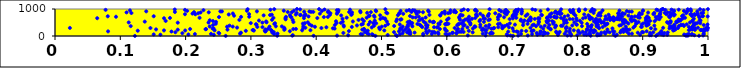
| Category | Series 1 |
|---|---|
| 0.5235519487011274 | 1 |
| 0.12230884167231788 | 2 |
| 0.2613283401278729 | 3 |
| 0.4906580673397771 | 4 |
| 0.8581940545886442 | 5 |
| 0.7016015833464653 | 6 |
| 0.920336045886645 | 7 |
| 0.395974808420415 | 8 |
| 0.9862856929596127 | 9 |
| 0.3403819532866777 | 10 |
| 0.8203217843344026 | 11 |
| 0.9665797291823008 | 12 |
| 0.9690369394837137 | 13 |
| 0.4319460523109031 | 14 |
| 0.36332149996460195 | 15 |
| 0.7093032348197085 | 16 |
| 0.7846863321712239 | 17 |
| 0.6974880248681622 | 18 |
| 0.724006448873877 | 19 |
| 0.6594788418653778 | 20 |
| 0.632229003712798 | 21 |
| 0.9925322709463121 | 22 |
| 0.7901314128307382 | 23 |
| 0.6927187217398437 | 24 |
| 0.8302139645202437 | 25 |
| 0.44890575004881694 | 26 |
| 0.3642412508110733 | 27 |
| 0.9792211535896298 | 28 |
| 0.9105873187091204 | 29 |
| 0.9130056764710549 | 30 |
| 0.9653042478911092 | 31 |
| 0.7998842324881448 | 32 |
| 0.5221488438668945 | 33 |
| 0.9318781116803568 | 34 |
| 0.5640719944765928 | 35 |
| 0.6003300168892703 | 36 |
| 0.5094333163284779 | 37 |
| 0.8330440270042285 | 38 |
| 0.7700869283270952 | 39 |
| 0.4870621742909035 | 40 |
| 0.8138638907979945 | 41 |
| 0.9377697819667304 | 42 |
| 0.7386854707068674 | 43 |
| 0.24322218665280765 | 44 |
| 0.7474692552265593 | 45 |
| 0.9226104825241993 | 46 |
| 0.8960210608921162 | 47 |
| 0.16140490115931838 | 48 |
| 0.8603837110387474 | 49 |
| 0.8355889966388377 | 50 |
| 0.8187516851222281 | 51 |
| 0.8103303035535738 | 52 |
| 0.9682721613812184 | 53 |
| 0.9633926857164341 | 54 |
| 0.9748035770810933 | 55 |
| 0.20424819549670423 | 56 |
| 0.7902966584332625 | 57 |
| 0.4705640627030336 | 58 |
| 0.15114734064947266 | 59 |
| 0.8555475475223804 | 60 |
| 0.6918818933441445 | 61 |
| 0.9935163346492036 | 62 |
| 0.9289537188377915 | 63 |
| 0.4856291143518542 | 64 |
| 0.7306141140192025 | 65 |
| 0.5283369973858142 | 66 |
| 0.9756455913237461 | 67 |
| 0.6038166437849264 | 68 |
| 0.4803362644103165 | 69 |
| 0.46824491840331517 | 70 |
| 0.3356759336342278 | 71 |
| 0.21419242960308968 | 72 |
| 0.8177757510452746 | 73 |
| 0.5769577891268622 | 74 |
| 0.7135872372799961 | 75 |
| 0.5980424195602325 | 76 |
| 0.5440987422949015 | 77 |
| 0.587230091233014 | 78 |
| 0.9705206501195806 | 79 |
| 0.23893677398587698 | 80 |
| 0.7805176637971478 | 81 |
| 0.8306779979204217 | 82 |
| 0.5637992537497213 | 83 |
| 0.7426662310274716 | 84 |
| 0.8788829460312485 | 85 |
| 0.8426533660346757 | 86 |
| 0.8835843161927791 | 87 |
| 0.6550645133893837 | 88 |
| 0.3407732397158864 | 89 |
| 0.28326047146116456 | 90 |
| 0.7711843388374329 | 91 |
| 0.9932292544319598 | 92 |
| 0.6661648517614093 | 93 |
| 0.6146220065951526 | 94 |
| 0.7547091397256117 | 95 |
| 0.9269930151025912 | 96 |
| 0.2515134599281263 | 97 |
| 0.5421419628289992 | 98 |
| 0.5322356945096024 | 99 |
| 0.8041808575284048 | 100 |
| 0.8192369134607009 | 101 |
| 0.6702411053321446 | 102 |
| 0.477920517331033 | 103 |
| 0.9258826303585026 | 104 |
| 0.19505394532257186 | 105 |
| 0.750925717939392 | 106 |
| 0.5698315667608013 | 107 |
| 0.6683038389808819 | 108 |
| 0.750944781343057 | 109 |
| 0.9112569583824525 | 110 |
| 0.7377377550132522 | 111 |
| 0.933335322232728 | 112 |
| 0.441612567077777 | 113 |
| 0.6082540977042036 | 114 |
| 0.7494368489265759 | 115 |
| 0.9291565547705396 | 116 |
| 0.2505506510575249 | 117 |
| 0.5820885150255793 | 118 |
| 0.609397768689713 | 119 |
| 0.7884562518320917 | 120 |
| 0.6679569294558733 | 121 |
| 0.8925045049421552 | 122 |
| 0.28481078692910217 | 123 |
| 0.8366155830227779 | 124 |
| 0.6602332830479136 | 125 |
| 0.550703287273192 | 126 |
| 0.3326733460989183 | 127 |
| 0.7682196576114201 | 128 |
| 0.8245956026715778 | 129 |
| 0.8656823815441198 | 130 |
| 0.9383946838630467 | 131 |
| 0.6160536277261074 | 132 |
| 0.5865858846131866 | 133 |
| 0.6396521600442944 | 134 |
| 0.8493602571276568 | 135 |
| 0.5391025068252928 | 136 |
| 0.9160744684771528 | 137 |
| 0.9007623364432581 | 138 |
| 0.18432985109953315 | 139 |
| 0.543708892847291 | 140 |
| 0.8415574765204903 | 141 |
| 0.519190777159661 | 142 |
| 0.4742169759082336 | 143 |
| 0.3349967483831373 | 144 |
| 0.8990737446223888 | 145 |
| 0.5805880002066636 | 146 |
| 0.7490557448137768 | 147 |
| 0.708928126310255 | 148 |
| 0.8128845114239555 | 149 |
| 0.8705622694810596 | 150 |
| 0.6257149832050453 | 151 |
| 0.7728411885396286 | 152 |
| 0.5777020405067421 | 153 |
| 0.7442284041129147 | 154 |
| 0.8759815008924945 | 155 |
| 0.8080263881397457 | 156 |
| 0.8014488351418213 | 157 |
| 0.6202112465237204 | 158 |
| 0.6227692604214488 | 159 |
| 0.7673709899633256 | 160 |
| 0.8454136492592794 | 161 |
| 0.6939836943531836 | 162 |
| 0.3220495808270462 | 163 |
| 0.8564161508163931 | 164 |
| 0.1783623383744279 | 165 |
| 0.9939626660669265 | 166 |
| 0.7070280688445979 | 167 |
| 0.568349949456651 | 168 |
| 0.7433648352089469 | 169 |
| 0.5267907039884581 | 170 |
| 0.08126696022789225 | 171 |
| 0.7829328401409156 | 172 |
| 0.4772623344564271 | 173 |
| 0.9059733641585581 | 174 |
| 0.8542640361579436 | 175 |
| 0.35966957422094115 | 176 |
| 0.5334407028638493 | 177 |
| 0.7301041680855334 | 178 |
| 0.7881211847275192 | 179 |
| 0.9286668740558869 | 180 |
| 0.4500569560984713 | 181 |
| 0.7301535117483269 | 182 |
| 0.7024175444573403 | 183 |
| 0.8272877537126094 | 184 |
| 0.5428114721474644 | 185 |
| 0.7215753049799427 | 186 |
| 0.3228512338871074 | 187 |
| 0.5999422875255558 | 188 |
| 0.6337267645985744 | 189 |
| 0.5730951698199869 | 190 |
| 0.7145210507509185 | 191 |
| 0.2922250349052479 | 192 |
| 0.8668368317487913 | 193 |
| 0.3318971456249642 | 194 |
| 0.32129394080411616 | 195 |
| 0.12671966796256956 | 196 |
| 0.8187458393586128 | 197 |
| 0.4789654889320767 | 198 |
| 0.8013173692215011 | 199 |
| 0.993619970936671 | 200 |
| 0.8716840016326416 | 201 |
| 0.30460120565764043 | 202 |
| 0.7329518784253726 | 203 |
| 0.1993211181962148 | 204 |
| 0.5042722021589667 | 205 |
| 0.6153783111803749 | 206 |
| 0.1669134216621404 | 207 |
| 0.946521459740113 | 208 |
| 0.7945065382835653 | 209 |
| 0.3784516274088653 | 210 |
| 0.24436717812384778 | 211 |
| 0.9478988307586219 | 212 |
| 0.6581069316482346 | 213 |
| 0.8217436245613633 | 214 |
| 0.3911702812747875 | 215 |
| 0.3037428570979069 | 216 |
| 0.8258379997002943 | 217 |
| 0.9706357433206427 | 218 |
| 0.9888171473285219 | 219 |
| 0.30269145733267716 | 220 |
| 0.5978375152446678 | 221 |
| 0.6540499203941836 | 222 |
| 0.8206123060160743 | 223 |
| 0.6605758234690693 | 224 |
| 0.9897140596943679 | 225 |
| 0.9799927370891722 | 226 |
| 0.33071675006904583 | 227 |
| 0.3511721003990729 | 228 |
| 0.873795010193375 | 229 |
| 0.9990617111579827 | 230 |
| 0.8756996267538104 | 231 |
| 0.9963832511653307 | 232 |
| 0.2641253229985399 | 233 |
| 0.18798168545604055 | 234 |
| 0.8797314738698051 | 235 |
| 0.541704034825394 | 236 |
| 0.47057619772781334 | 237 |
| 0.9760385969268773 | 238 |
| 0.9729428589131437 | 239 |
| 0.8144944399409192 | 240 |
| 0.5364049880960107 | 241 |
| 0.9501293812977795 | 242 |
| 0.8459320622358165 | 243 |
| 0.3222580660547085 | 244 |
| 0.1547616302566619 | 245 |
| 0.7592742620327195 | 246 |
| 0.8762334404720238 | 247 |
| 0.9936511425193604 | 248 |
| 0.8700670002621991 | 249 |
| 0.49746919341946044 | 250 |
| 0.4730921960794678 | 251 |
| 0.2312896462073643 | 252 |
| 0.23055580181900745 | 253 |
| 0.9192915577984264 | 254 |
| 0.5286428330041713 | 255 |
| 0.8152106688993749 | 256 |
| 0.589478554579398 | 257 |
| 0.36494692784609856 | 258 |
| 0.2069615132158382 | 259 |
| 0.6237534375254389 | 260 |
| 0.473387533967175 | 261 |
| 0.36895286020038165 | 262 |
| 0.8747051568766743 | 263 |
| 0.6171698344137668 | 264 |
| 0.32616817872944204 | 265 |
| 0.5309116644367678 | 266 |
| 0.3516503484896553 | 267 |
| 0.6684757550009 | 268 |
| 0.7582083071638687 | 269 |
| 0.6558066238453091 | 270 |
| 0.7884732509622105 | 271 |
| 0.7474824052960707 | 272 |
| 0.5680007749017021 | 273 |
| 0.4282491934926879 | 274 |
| 0.5971017638138066 | 275 |
| 0.2413955524204215 | 276 |
| 0.6400128040085308 | 277 |
| 0.7825661166102377 | 278 |
| 0.9461720714360553 | 279 |
| 0.6712320381065257 | 280 |
| 0.24282279970337461 | 281 |
| 0.8536591271203494 | 282 |
| 0.9409943204512086 | 283 |
| 0.4255726615764859 | 284 |
| 0.7007594123905019 | 285 |
| 0.9126607768706497 | 286 |
| 0.685139398818656 | 287 |
| 0.9806193846729072 | 288 |
| 0.9973627105509255 | 289 |
| 0.8333565972631097 | 290 |
| 0.3801598172058873 | 291 |
| 0.9763239710741989 | 292 |
| 0.529253176278306 | 293 |
| 0.9540461187877002 | 294 |
| 0.1461536635208711 | 295 |
| 0.40798232178279786 | 296 |
| 0.6120793474402392 | 297 |
| 0.6726914299339141 | 298 |
| 0.02279367073040658 | 299 |
| 0.9999562973177825 | 300 |
| 0.7282046443763439 | 301 |
| 0.6853035410951196 | 302 |
| 0.9979719514962117 | 303 |
| 0.931304533150216 | 304 |
| 0.3834283745572842 | 305 |
| 0.9845472027089599 | 306 |
| 0.3509170026399535 | 307 |
| 0.9458262216973878 | 308 |
| 0.7826658897634824 | 309 |
| 0.49633492529834344 | 310 |
| 0.8856908456882074 | 311 |
| 0.27882386866281567 | 312 |
| 0.7553301268825903 | 313 |
| 0.5384494601190284 | 314 |
| 0.585042855225897 | 315 |
| 0.6640413255040323 | 316 |
| 0.4851392932992471 | 317 |
| 0.7658444990063564 | 318 |
| 0.6315592814014216 | 319 |
| 0.8321298384137502 | 320 |
| 0.9454210320851694 | 321 |
| 0.5700440151138236 | 322 |
| 0.41556980816739547 | 323 |
| 0.6950703193657976 | 324 |
| 0.580430415584356 | 325 |
| 0.6788463671071462 | 326 |
| 0.8209051094042942 | 327 |
| 0.7834857079628794 | 328 |
| 0.31772527071170586 | 329 |
| 0.5624099021328256 | 330 |
| 0.6514221789742791 | 331 |
| 0.5861149930310036 | 332 |
| 0.9708395971305014 | 333 |
| 0.838654856834232 | 334 |
| 0.30981164801133676 | 335 |
| 0.45455520258278725 | 336 |
| 0.9488946968674664 | 337 |
| 0.8976252398195472 | 338 |
| 0.6437124668791259 | 339 |
| 0.9758393979783831 | 340 |
| 0.6865907225341776 | 341 |
| 0.3981026758006774 | 342 |
| 0.898677120703996 | 343 |
| 0.26347340947492287 | 344 |
| 0.7440397742569229 | 345 |
| 0.5003778293831095 | 346 |
| 0.32857324433319995 | 347 |
| 0.2722116337117664 | 348 |
| 0.5324383122702436 | 349 |
| 0.9437370649913569 | 350 |
| 0.8739781315238256 | 351 |
| 0.23689646684146165 | 352 |
| 0.44239428254905994 | 353 |
| 0.8163148316613855 | 354 |
| 0.3474318222311767 | 355 |
| 0.8294253651011824 | 356 |
| 0.5473036288626207 | 357 |
| 0.6427035268927515 | 358 |
| 0.3382077478393938 | 359 |
| 0.5408072582745891 | 360 |
| 0.9416266873669131 | 361 |
| 0.7366749385770921 | 362 |
| 0.38027726161747 | 363 |
| 0.8069189812504635 | 364 |
| 0.8203728357735739 | 365 |
| 0.11591327349100597 | 366 |
| 0.8879479300022468 | 367 |
| 0.766981693954358 | 368 |
| 0.9553434559426401 | 369 |
| 0.6596225127032601 | 370 |
| 0.6887725310843295 | 371 |
| 0.5194111759177312 | 372 |
| 0.9631659176749274 | 373 |
| 0.6254925997705589 | 374 |
| 0.6848020186006963 | 375 |
| 0.7771376481949588 | 376 |
| 0.7498963646735824 | 377 |
| 0.4885373414539868 | 378 |
| 0.5057738722880508 | 379 |
| 0.7749975678922264 | 380 |
| 0.5604654530507399 | 381 |
| 0.39321171604198507 | 382 |
| 0.9057102986513071 | 383 |
| 0.26727144755791776 | 384 |
| 0.9485927033323853 | 385 |
| 0.917818353906267 | 386 |
| 0.7670081614005915 | 387 |
| 0.9778621129740548 | 388 |
| 0.8642265449447727 | 389 |
| 0.7921640314792675 | 390 |
| 0.4624373352561892 | 391 |
| 0.8426456780014989 | 392 |
| 0.44194490545744625 | 393 |
| 0.9578403894762118 | 394 |
| 0.6158258575916441 | 395 |
| 0.5682233916340682 | 396 |
| 0.570633007114956 | 397 |
| 0.5401537203768864 | 398 |
| 0.7311768505990132 | 399 |
| 0.7168362061286889 | 400 |
| 0.8668919441788233 | 401 |
| 0.8219782883978802 | 402 |
| 0.9070846093178815 | 403 |
| 0.9935030421405895 | 404 |
| 0.6272439642723812 | 405 |
| 0.24203444979435454 | 406 |
| 0.4285395567541678 | 407 |
| 0.8294696119777346 | 408 |
| 0.664990965443159 | 409 |
| 0.9482131326224118 | 410 |
| 0.7569753665896373 | 411 |
| 0.8315562615430415 | 412 |
| 0.6924821846833281 | 413 |
| 0.962093551315797 | 414 |
| 0.5585849931437898 | 415 |
| 0.9591371167129432 | 416 |
| 0.6513849551831268 | 417 |
| 0.3087005299502792 | 418 |
| 0.7991141358900574 | 419 |
| 0.7333822111762678 | 420 |
| 0.7043986996543622 | 421 |
| 0.4692326001832518 | 422 |
| 0.6360541971425578 | 423 |
| 0.8984207867675672 | 424 |
| 0.48019320798743964 | 425 |
| 0.9993102954036404 | 426 |
| 0.5280701330519852 | 427 |
| 0.9091569197086035 | 428 |
| 0.38977523202419895 | 429 |
| 0.798513980830302 | 430 |
| 0.9673604196249163 | 431 |
| 0.617602231885556 | 432 |
| 0.5889417776432773 | 433 |
| 0.5460185766573261 | 434 |
| 0.5989306866601409 | 435 |
| 0.30771076216185334 | 436 |
| 0.509899075646618 | 437 |
| 0.597495606833769 | 438 |
| 0.6784127909953954 | 439 |
| 0.9781454806219565 | 440 |
| 0.8456208076112549 | 441 |
| 0.7403170181388465 | 442 |
| 0.5998606779695309 | 443 |
| 0.4713533133536791 | 444 |
| 0.555050628339182 | 445 |
| 0.3358832864605372 | 446 |
| 0.9808549094016593 | 447 |
| 0.7236925363312884 | 448 |
| 0.815006068597113 | 449 |
| 0.8294929473158775 | 450 |
| 0.6184404978054113 | 451 |
| 0.6024716222831478 | 452 |
| 0.24620345869592017 | 453 |
| 0.9084919806981383 | 454 |
| 0.7629755264260972 | 455 |
| 0.8900107661039168 | 456 |
| 0.6812629396059169 | 457 |
| 0.5871712536762966 | 458 |
| 0.3796207776948996 | 459 |
| 0.5997462286269366 | 460 |
| 0.6001904399929348 | 461 |
| 0.8457878697941795 | 462 |
| 0.8779336131741025 | 463 |
| 0.900686096230294 | 464 |
| 0.6223439713402721 | 465 |
| 0.6964891771075236 | 466 |
| 0.8708671562697938 | 467 |
| 0.636160442727238 | 468 |
| 0.9801298969897176 | 469 |
| 0.49187644822778714 | 470 |
| 0.3369609020109338 | 471 |
| 0.488794258104288 | 472 |
| 0.9883207808225496 | 473 |
| 0.5422791472556074 | 474 |
| 0.7797365115412334 | 475 |
| 0.3826286747548335 | 476 |
| 0.29975564804315435 | 477 |
| 0.8904663374305373 | 478 |
| 0.4873508538147648 | 479 |
| 0.43114338031793775 | 480 |
| 0.9391269068104175 | 481 |
| 0.8408244968489349 | 482 |
| 0.5469839336305333 | 483 |
| 0.5672934152080318 | 484 |
| 0.870772230382125 | 485 |
| 0.4376853374725861 | 486 |
| 0.9840381742304635 | 487 |
| 0.8291107456444622 | 488 |
| 0.8065394304849758 | 489 |
| 0.9041279860889454 | 490 |
| 0.8367990103699615 | 491 |
| 0.9403576646766243 | 492 |
| 0.18799088817533421 | 493 |
| 0.6246490479726435 | 494 |
| 0.7837276130664494 | 495 |
| 0.31761594259546944 | 496 |
| 0.2350699669900016 | 497 |
| 0.9426780030195506 | 498 |
| 0.7168986304785984 | 499 |
| 0.9722991468712524 | 500 |
| 0.951685942556015 | 501 |
| 0.7534726682224702 | 502 |
| 0.11290774352121893 | 503 |
| 0.8280934464942687 | 504 |
| 0.7953593326691196 | 505 |
| 0.6351370558785063 | 506 |
| 0.3871309297805687 | 507 |
| 0.32407691716836207 | 508 |
| 0.9372789871697917 | 509 |
| 0.5785043000643645 | 510 |
| 0.8286520425216781 | 511 |
| 0.5801892394457234 | 512 |
| 0.7637034085098178 | 513 |
| 0.5400634407996049 | 514 |
| 0.893708583339412 | 515 |
| 0.3650973097515876 | 516 |
| 0.8751735302034209 | 517 |
| 0.7411715682174504 | 518 |
| 0.5435402659375066 | 519 |
| 0.8397811775599712 | 520 |
| 0.7541361459245401 | 521 |
| 0.6568327297971633 | 522 |
| 0.48239674738581584 | 523 |
| 0.246594528335261 | 524 |
| 0.7537345724659265 | 525 |
| 0.9080595865951305 | 526 |
| 0.5799260612347762 | 527 |
| 0.8359504564484391 | 528 |
| 0.7406082814163597 | 529 |
| 0.9422000132349565 | 530 |
| 0.44071092392508626 | 531 |
| 0.13749936124725723 | 532 |
| 0.5908740267781228 | 533 |
| 0.9514731403626062 | 534 |
| 0.8317766197563903 | 535 |
| 0.5645369787664614 | 536 |
| 0.45621887751566154 | 537 |
| 0.3232783998784303 | 538 |
| 0.5082102054800326 | 539 |
| 0.8694551293648718 | 540 |
| 0.8252539549108967 | 541 |
| 0.5429480316565125 | 542 |
| 0.954094790994007 | 543 |
| 0.5739603511309134 | 544 |
| 0.43029424906524966 | 545 |
| 0.8830331836395008 | 546 |
| 0.5226103797514148 | 547 |
| 0.9428290686821159 | 548 |
| 0.6500992465967582 | 549 |
| 0.9182801451683835 | 550 |
| 0.7615658590727729 | 551 |
| 0.7527908545979195 | 552 |
| 0.8890152563771073 | 553 |
| 0.24187793472964683 | 554 |
| 0.47296287437338996 | 555 |
| 0.9758206278685306 | 556 |
| 0.16950847932226198 | 557 |
| 0.6331201321382466 | 558 |
| 0.6252563008825461 | 559 |
| 0.9113901969486067 | 560 |
| 0.8696261567206646 | 561 |
| 0.7248565983577785 | 562 |
| 0.724428975714906 | 563 |
| 0.8038858737035528 | 564 |
| 0.9765477888288466 | 565 |
| 0.9569301324958279 | 566 |
| 0.7282317250754446 | 567 |
| 0.7793415603201111 | 568 |
| 0.5569758616339632 | 569 |
| 0.8311142414031274 | 570 |
| 0.4896946130063296 | 571 |
| 0.3123647207973445 | 572 |
| 0.9886562597124186 | 573 |
| 0.7130821401853669 | 574 |
| 0.756201300207612 | 575 |
| 0.8324695642092452 | 576 |
| 0.7188809030478562 | 577 |
| 0.8559500198691506 | 578 |
| 0.9059397951343241 | 579 |
| 0.8729962787895855 | 580 |
| 0.7991749161660218 | 581 |
| 0.9872589637027532 | 582 |
| 0.23698274767724878 | 583 |
| 0.7827816089752325 | 584 |
| 0.8556140813277429 | 585 |
| 0.904811598159024 | 586 |
| 0.8864184830391275 | 587 |
| 0.6637589488678571 | 588 |
| 0.9559899736810638 | 589 |
| 0.6510225305092551 | 590 |
| 0.850083879524237 | 591 |
| 0.8277418892907207 | 592 |
| 0.8818953742918464 | 593 |
| 0.9573842691069387 | 594 |
| 0.46483847500856673 | 595 |
| 0.2823482758772858 | 596 |
| 0.36400634769710455 | 597 |
| 0.6202472535305794 | 598 |
| 0.9587220625616697 | 599 |
| 0.3323401979193569 | 600 |
| 0.6343953207233752 | 601 |
| 0.6002873883440943 | 602 |
| 0.834300686997401 | 603 |
| 0.5288658611733148 | 604 |
| 0.8707385707641525 | 605 |
| 0.5592986253444014 | 606 |
| 0.7135386779931373 | 607 |
| 0.6280156052542608 | 608 |
| 0.7259325513093148 | 609 |
| 0.6658418378451432 | 610 |
| 0.8547995016384009 | 611 |
| 0.9551000221945262 | 612 |
| 0.8642253609353981 | 613 |
| 0.5235857185590844 | 614 |
| 0.7413563899600721 | 615 |
| 0.6785388205058448 | 616 |
| 0.35319292655459744 | 617 |
| 0.8426194738979306 | 618 |
| 0.4705444660198549 | 619 |
| 0.530487206669182 | 620 |
| 0.9254169948036738 | 621 |
| 0.8193543408673707 | 622 |
| 0.9210613066344174 | 623 |
| 0.8512282844428897 | 624 |
| 0.792820665143203 | 625 |
| 0.8609139312894976 | 626 |
| 0.8456556075221622 | 627 |
| 0.6962463330551671 | 628 |
| 0.8815482013881184 | 629 |
| 0.7882255497976468 | 630 |
| 0.734645030048658 | 631 |
| 0.4983041642616458 | 632 |
| 0.6315137668233295 | 633 |
| 0.7786056775612513 | 634 |
| 0.44031099463234974 | 635 |
| 0.8285123179440946 | 636 |
| 0.6385929363790969 | 637 |
| 0.5625310571578416 | 638 |
| 0.8549079369571577 | 639 |
| 0.5051733287156943 | 640 |
| 0.8610226064187831 | 641 |
| 0.5055357770077464 | 642 |
| 0.7288582679905456 | 643 |
| 0.978369328322576 | 644 |
| 0.658582523751179 | 645 |
| 0.8660551261895538 | 646 |
| 0.8185655876239349 | 647 |
| 0.8627567282330925 | 648 |
| 0.8226618839157233 | 649 |
| 0.602889501807224 | 650 |
| 0.6560364882619077 | 651 |
| 0.70115716564423 | 652 |
| 0.8086298464685682 | 653 |
| 0.7984448926314149 | 654 |
| 0.7398085721609631 | 655 |
| 0.16698055520639254 | 656 |
| 0.6193909010369687 | 657 |
| 0.9618649538457944 | 658 |
| 0.06465754427067126 | 659 |
| 0.3812598428991331 | 660 |
| 0.8600984523407392 | 661 |
| 0.7416899431090438 | 662 |
| 0.3529028904262392 | 663 |
| 0.753557607249965 | 664 |
| 0.4017281295618945 | 665 |
| 0.6435956922442212 | 666 |
| 0.904720960464073 | 667 |
| 0.9092937690926022 | 668 |
| 0.17607283016484507 | 669 |
| 0.3344689022731271 | 670 |
| 0.706444336060456 | 671 |
| 0.7748470578984508 | 672 |
| 0.2213898233803159 | 673 |
| 0.5017467666398532 | 674 |
| 0.8204880052445852 | 675 |
| 0.9648989824036915 | 676 |
| 0.47733689450058614 | 677 |
| 0.8954237513533592 | 678 |
| 0.44671188159133024 | 679 |
| 0.8498376865370062 | 680 |
| 0.7674309608182751 | 681 |
| 0.7535339470074199 | 682 |
| 0.8555240601644057 | 683 |
| 0.8125545304524842 | 684 |
| 0.5676151495803732 | 685 |
| 0.9867271046852674 | 686 |
| 0.5524235499015512 | 687 |
| 0.8930845744155221 | 688 |
| 0.5477311393156866 | 689 |
| 0.8548884171231897 | 690 |
| 0.7280953799327712 | 691 |
| 0.7685688556996364 | 692 |
| 0.9413814149500769 | 693 |
| 0.6876894583400677 | 694 |
| 0.61883385165437 | 695 |
| 0.6783287827419423 | 696 |
| 0.8491089481342906 | 697 |
| 0.8828763978420352 | 698 |
| 0.36193410567504775 | 699 |
| 0.7646561977067944 | 700 |
| 0.25116357205796297 | 701 |
| 0.4116873990135851 | 702 |
| 0.9275455242487992 | 703 |
| 0.9199979010906677 | 704 |
| 0.7590966853546405 | 705 |
| 0.4178217196255146 | 706 |
| 0.9870679663514548 | 707 |
| 0.4893582527577138 | 708 |
| 0.28491618738215563 | 709 |
| 0.35371365418632 | 710 |
| 0.883192413818917 | 711 |
| 0.9070532927494146 | 712 |
| 0.09339856641410686 | 713 |
| 0.5572064998170121 | 714 |
| 0.29737747800884873 | 715 |
| 0.6340095419313979 | 716 |
| 0.36073133013149183 | 717 |
| 0.756163483189713 | 718 |
| 0.9065650835537916 | 719 |
| 0.8185495305197505 | 720 |
| 0.9403028449548491 | 721 |
| 0.7803999771502688 | 722 |
| 0.3882910037914954 | 723 |
| 0.8880232024377643 | 724 |
| 0.9995659604709032 | 725 |
| 0.7646874101428074 | 726 |
| 0.8686087558110754 | 727 |
| 0.7007986516105085 | 728 |
| 0.8431225065587109 | 729 |
| 0.08080648906789455 | 730 |
| 0.9240869543656725 | 731 |
| 0.15116256551928722 | 732 |
| 0.8924078389112553 | 733 |
| 0.9923169707852649 | 734 |
| 0.9913143910744533 | 735 |
| 0.9602520948176048 | 736 |
| 0.38135437193575966 | 737 |
| 0.7009221977585319 | 738 |
| 0.5436577776845208 | 739 |
| 0.9754850367771314 | 740 |
| 0.4808441400009162 | 741 |
| 0.867272379856632 | 742 |
| 0.7048487655759869 | 743 |
| 0.9425344258161013 | 744 |
| 0.6633264156629319 | 745 |
| 0.942355136356868 | 746 |
| 0.7209292298456423 | 747 |
| 0.6463809420886991 | 748 |
| 0.6555010474336849 | 749 |
| 0.48172236303847454 | 750 |
| 0.8630241888303155 | 751 |
| 0.8354050035686459 | 752 |
| 0.2742239819342524 | 753 |
| 0.48850919642145574 | 754 |
| 0.6817163101409458 | 755 |
| 0.8780724509335519 | 756 |
| 0.7856639208893667 | 757 |
| 0.831418311100233 | 758 |
| 0.6628569687424973 | 759 |
| 0.947826790078415 | 760 |
| 0.4382231436296306 | 761 |
| 0.5901231589061973 | 762 |
| 0.7970061903181579 | 763 |
| 0.3195422857501843 | 764 |
| 0.6241934387508775 | 765 |
| 0.49791995295669167 | 766 |
| 0.5897904127023161 | 767 |
| 0.8168398210036614 | 768 |
| 0.5251167275423793 | 769 |
| 0.9620469448701704 | 770 |
| 0.7456503720707797 | 771 |
| 0.6212039447434815 | 772 |
| 0.35980206785708607 | 773 |
| 0.37562586684886845 | 774 |
| 0.3836139760339926 | 775 |
| 0.3292940579499904 | 776 |
| 0.9800117027638424 | 777 |
| 0.9846225799200254 | 778 |
| 0.6211010018694244 | 779 |
| 0.5733897899144781 | 780 |
| 0.7446749787513941 | 781 |
| 0.7017018410209472 | 782 |
| 0.4209884691804551 | 783 |
| 0.3760624281457701 | 784 |
| 0.6798874665854412 | 785 |
| 0.45368643254836377 | 786 |
| 0.332140784890526 | 787 |
| 0.8477541231295272 | 788 |
| 0.6453312203200323 | 789 |
| 0.6446622571520232 | 790 |
| 0.9491124349824296 | 791 |
| 0.8947133851936598 | 792 |
| 0.7578931545773085 | 793 |
| 0.3688155200109694 | 794 |
| 0.9425987166461167 | 795 |
| 0.8945750067548166 | 796 |
| 0.2661399882379245 | 797 |
| 0.691106478978164 | 798 |
| 0.38315480924605844 | 799 |
| 0.45452835952007764 | 800 |
| 0.8104410161790964 | 801 |
| 0.9730768176720833 | 802 |
| 0.7235605508718891 | 803 |
| 0.9364585227170523 | 804 |
| 0.2149385025097279 | 805 |
| 0.7064095035587038 | 806 |
| 0.19904852908792847 | 807 |
| 0.92645917757771 | 808 |
| 0.7732245002794738 | 809 |
| 0.5540994719475453 | 810 |
| 0.2972802404169328 | 811 |
| 0.9164241972115498 | 812 |
| 0.9793984302806249 | 813 |
| 0.9745804162907971 | 814 |
| 0.7944693823452557 | 815 |
| 0.8679381521788463 | 816 |
| 0.9263283069881544 | 817 |
| 0.8986151065126551 | 818 |
| 0.9450723426010539 | 819 |
| 0.6645041011210617 | 820 |
| 0.8723737539175874 | 821 |
| 0.5333220332351121 | 822 |
| 0.6512872933307748 | 823 |
| 0.7692280353990156 | 824 |
| 0.9172774963026438 | 825 |
| 0.4316646070944628 | 826 |
| 0.7756254728252502 | 827 |
| 0.40566797637340696 | 828 |
| 0.21051651079759334 | 829 |
| 0.5971686468479764 | 830 |
| 0.7144996286177514 | 831 |
| 0.6918613454142565 | 832 |
| 0.27244147090312926 | 833 |
| 0.9839931298399308 | 834 |
| 0.8622888512647231 | 835 |
| 0.5269647659046103 | 836 |
| 0.8631736243273451 | 837 |
| 0.9470785105203192 | 838 |
| 0.8333669714838338 | 839 |
| 0.7604182769158152 | 840 |
| 0.6741980621139892 | 841 |
| 0.21930025258611885 | 842 |
| 0.5089057667477382 | 843 |
| 0.5279286043877587 | 844 |
| 0.4217322615675573 | 845 |
| 0.8951724520420088 | 846 |
| 0.9897930257988309 | 847 |
| 0.8691062657895391 | 848 |
| 0.6021277729633914 | 849 |
| 0.9668204189280919 | 850 |
| 0.11701685324786187 | 851 |
| 0.3701286916264771 | 852 |
| 0.8248314705115495 | 853 |
| 0.6895878626430906 | 854 |
| 0.9925398632369727 | 855 |
| 0.5534466429526251 | 856 |
| 0.9336941279329001 | 857 |
| 0.9178309707218805 | 858 |
| 0.5927396765479898 | 859 |
| 0.6882387171802393 | 860 |
| 0.47809739099687354 | 861 |
| 0.6051155508101593 | 862 |
| 0.8358468496601961 | 863 |
| 0.43250064728400617 | 864 |
| 0.7709085601260034 | 865 |
| 0.703854529228207 | 866 |
| 0.507252847589601 | 867 |
| 0.908257501548757 | 868 |
| 0.9421309644989355 | 869 |
| 0.7654470048828808 | 870 |
| 0.22295842836482982 | 871 |
| 0.45491441693868967 | 872 |
| 0.9666305431780959 | 873 |
| 0.10959046641276553 | 874 |
| 0.7941063873467528 | 875 |
| 0.9380432644902362 | 876 |
| 0.23545621691101393 | 877 |
| 0.6139225724023386 | 878 |
| 0.46790722152722136 | 879 |
| 0.5635819762915248 | 880 |
| 0.36260313323385335 | 881 |
| 0.4179505256974244 | 882 |
| 0.4837754414188497 | 883 |
| 0.21297139449890168 | 884 |
| 0.4504433606657546 | 885 |
| 0.7902118896778025 | 886 |
| 0.552715903323345 | 887 |
| 0.1835760779158372 | 888 |
| 0.3563949883472874 | 889 |
| 0.5458979165232756 | 890 |
| 0.9270949123298882 | 891 |
| 0.3955263580373237 | 892 |
| 0.39195903542366456 | 893 |
| 0.6936760711484804 | 894 |
| 0.6134558635551955 | 895 |
| 0.5544900470370314 | 896 |
| 0.5576426164104938 | 897 |
| 0.6108037321276938 | 898 |
| 0.8796131154684624 | 899 |
| 0.38161589679351887 | 900 |
| 0.7081978488980546 | 901 |
| 0.7731017689921077 | 902 |
| 0.4337240604374371 | 903 |
| 0.8833382667417234 | 904 |
| 0.5725719487701315 | 905 |
| 0.7667366029793192 | 906 |
| 0.715192094501642 | 907 |
| 0.3895509121553926 | 908 |
| 0.25571092209448126 | 909 |
| 0.5967868142511374 | 910 |
| 0.25316431415785773 | 911 |
| 0.3092499845499903 | 912 |
| 0.13969704727175067 | 913 |
| 0.9476419284443 | 914 |
| 0.9836192663113786 | 915 |
| 0.6834474656198747 | 916 |
| 0.7038161351909962 | 917 |
| 0.49182639372456854 | 918 |
| 0.8202172248075189 | 919 |
| 0.4184851661126767 | 920 |
| 0.6458814121963852 | 921 |
| 0.46739737591277103 | 922 |
| 0.8756116987699426 | 923 |
| 0.8024903299051086 | 924 |
| 0.9686492867740192 | 925 |
| 0.7435009966271474 | 926 |
| 0.4086911212427795 | 927 |
| 0.5292372759290823 | 928 |
| 0.9631141558309698 | 929 |
| 0.20243172144633403 | 930 |
| 0.9000789888852998 | 931 |
| 0.5383462368253963 | 932 |
| 0.9740044969894973 | 933 |
| 0.29395687567891393 | 934 |
| 0.8023746636996291 | 935 |
| 0.365823801507166 | 936 |
| 0.35036104445908806 | 937 |
| 0.5713305052153631 | 938 |
| 0.8220834968683051 | 939 |
| 0.8644168963855836 | 940 |
| 0.9480352430569211 | 941 |
| 0.6891070255479378 | 942 |
| 0.6223326920391272 | 943 |
| 0.550922049364533 | 944 |
| 0.9005875167932139 | 945 |
| 0.49119781014758934 | 946 |
| 0.6117972263736717 | 947 |
| 0.1147584373854172 | 948 |
| 0.8385619308287059 | 949 |
| 0.6056475213627496 | 950 |
| 0.6431764115063496 | 951 |
| 0.7884969095420519 | 952 |
| 0.4316318309984269 | 953 |
| 0.5478907478185692 | 954 |
| 0.9228511060789689 | 955 |
| 0.8262908147873781 | 956 |
| 0.22734388451132748 | 957 |
| 0.43413763397447436 | 958 |
| 0.5424549834589514 | 959 |
| 0.9931402264422795 | 960 |
| 0.6323751045175781 | 961 |
| 0.680440855413333 | 962 |
| 0.690663277818016 | 963 |
| 0.7356126788631777 | 964 |
| 0.7060358966315974 | 965 |
| 0.9347142357194745 | 966 |
| 0.7935417981966474 | 967 |
| 0.0774904064624003 | 968 |
| 0.19906630917035997 | 969 |
| 0.6439898876836064 | 970 |
| 0.9284098540869905 | 971 |
| 0.32992540700165535 | 972 |
| 0.4518202716178272 | 973 |
| 0.9551587049784345 | 974 |
| 0.9211904481860725 | 975 |
| 0.7146856642471782 | 976 |
| 0.9441889192435936 | 977 |
| 0.8120312204768978 | 978 |
| 0.7548619660024702 | 979 |
| 0.41272028823012963 | 980 |
| 0.18344543289780588 | 981 |
| 0.8024259974339467 | 982 |
| 0.7096306151141235 | 983 |
| 0.3753145456826434 | 984 |
| 0.6258725483320302 | 985 |
| 0.7750638205091932 | 986 |
| 0.9734502788964868 | 987 |
| 0.7311209754596629 | 988 |
| 0.9689306461172666 | 989 |
| 0.9878200777394717 | 990 |
| 0.5059211699105888 | 991 |
| 0.6654878148654915 | 992 |
| 0.2949469282359451 | 993 |
| 0.33575591800117943 | 994 |
| 0.9998726803685017 | 995 |
| 0.40442721680091626 | 996 |
| 0.9309914367235608 | 997 |
| 0.8228760860780232 | 998 |
| 0.9303319704409589 | 999 |
| 0.3704837193397909 | 1000 |